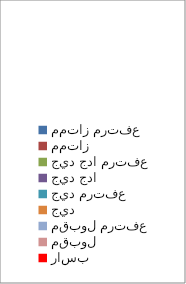
| Category | Series 2 | Series 3 | Series 1 | Series 0 |
|---|---|---|---|---|
| ممتاز مرتفع  | 0 | 0 | 0 | 0 |
| ممتاز   | 0 | 0 | 0 | 0 |
| جيد جدا مرتفع | 0 | 0 | 0 | 0 |
| جيد جدا  | 0 | 0 | 0 | 0 |
| جيد مرتفع  | 0 | 0 | 0 | 0 |
| جيد | 0 | 0 | 0 | 0 |
| مقبول مرتفع | 0 | 0 | 0 | 0 |
| مقبول   | 0 | 0 | 0 | 0 |
| راسب | 0 | 0 | 0 | 0 |